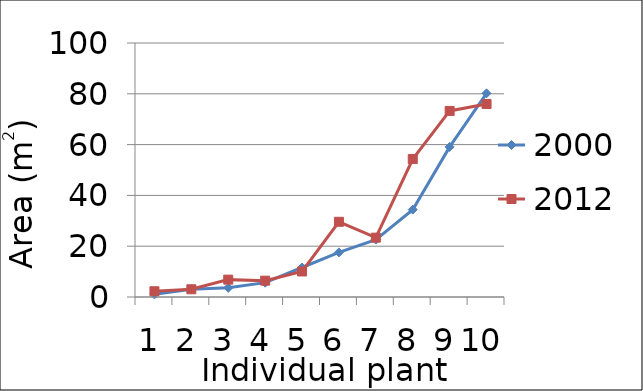
| Category | 2000 | 2012 |
|---|---|---|
| 0 | 1.061 | 2.267 |
| 1 | 3.04 | 3.04 |
| 2 | 3.617 | 6.839 |
| 3 | 5.652 | 6.431 |
| 4 | 11.612 | 10.048 |
| 5 | 17.567 | 29.611 |
| 6 | 22.608 | 23.368 |
| 7 | 34.389 | 54.316 |
| 8 | 59.089 | 73.25 |
| 9 | 80.189 | 75.988 |